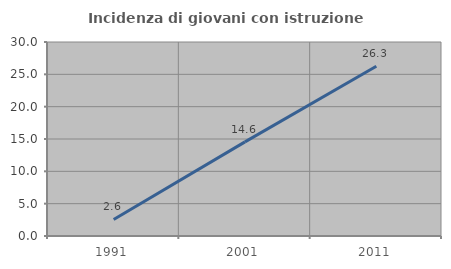
| Category | Incidenza di giovani con istruzione universitaria |
|---|---|
| 1991.0 | 2.564 |
| 2001.0 | 14.557 |
| 2011.0 | 26.259 |